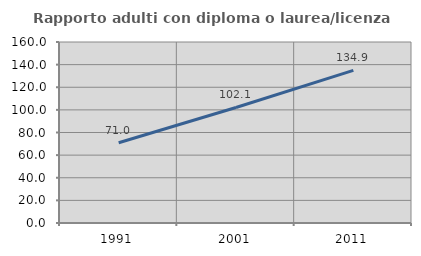
| Category | Rapporto adulti con diploma o laurea/licenza media  |
|---|---|
| 1991.0 | 70.957 |
| 2001.0 | 102.111 |
| 2011.0 | 134.916 |